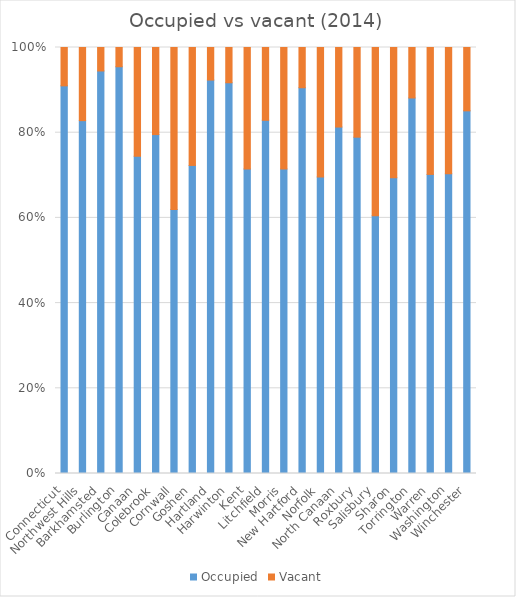
| Category | Occupied | Vacant |
|---|---|---|
| Connecticut | 1356206 | 134175 |
| Northwest Hills | 46328 | 9602 |
| Barkhamsted | 1475 | 86 |
| Burlington | 3381 | 160 |
| Canaan | 575 | 197 |
| Colebrook | 615 | 158 |
| Cornwall | 621 | 381 |
| Goshen | 1225 | 469 |
| Hartland | 761 | 63 |
| Harwinton | 2072 | 187 |
| Kent | 1125 | 449 |
| Litchfield | 3454 | 712 |
| Morris | 925 | 369 |
| New Hartford | 2702 | 282 |
| Norfolk | 635 | 277 |
| North Canaan | 1298 | 298 |
| Roxbury | 945 | 252 |
| Salisbury | 1499 | 979 |
| Sharon | 1261 | 555 |
| Torrington | 14820 | 1992 |
| Warren | 575 | 244 |
| Washington | 1545 | 650 |
| Winchester | 4819 | 842 |